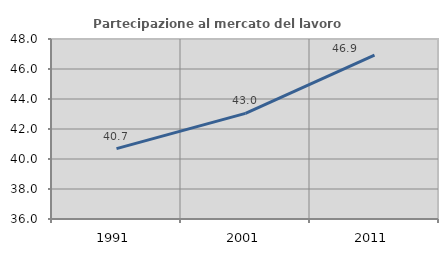
| Category | Partecipazione al mercato del lavoro  femminile |
|---|---|
| 1991.0 | 40.694 |
| 2001.0 | 43.041 |
| 2011.0 | 46.931 |